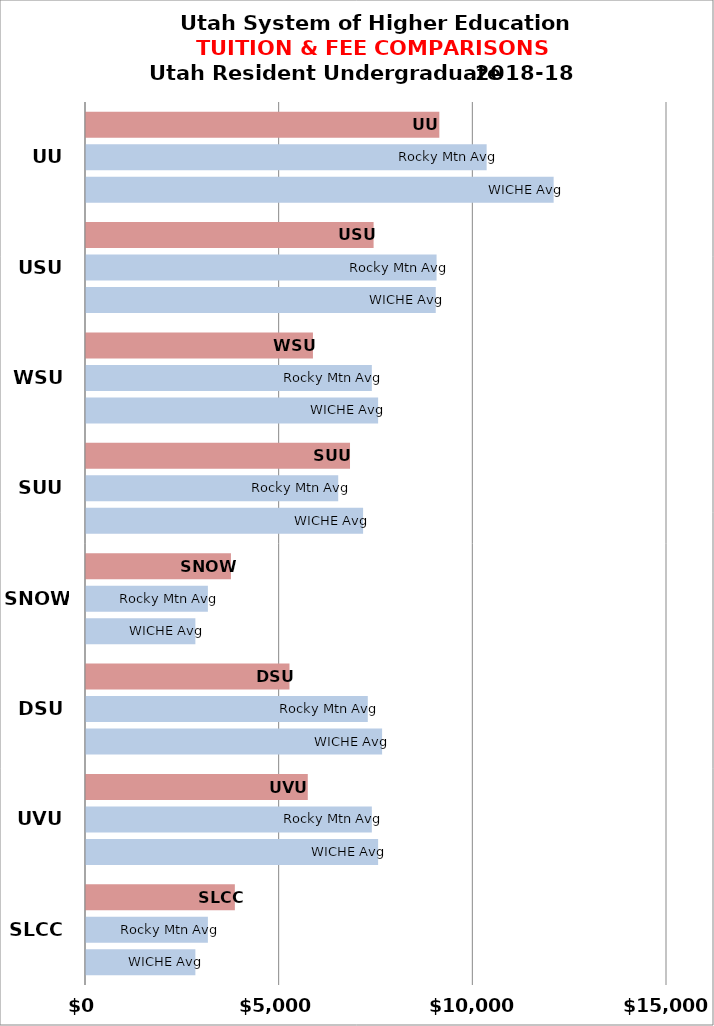
| Category | WICHE Avg | Rocky Mtn Avg | USHE Inst |
|---|---|---|---|
| SLCC | 2823.627 | 3146.717 | 3843 |
| UVU | 7541.7 | 7379.667 | 5726 |
| DSU | 7644.318 | 7275 | 5253 |
| SNOW | 2823.627 | 3146.717 | 3742 |
| SUU | 7153.8 | 6511.5 | 6816 |
| WSU | 7541.7 | 7379.667 | 5859 |
| USU | 9029.733 | 9050.889 | 7425 |
| UU | 12073.429 | 10343.75 | 9122 |